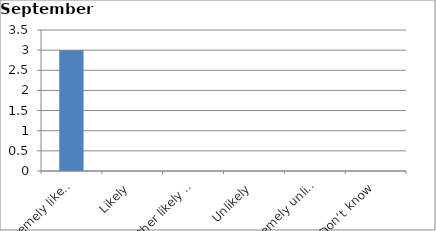
| Category | Series 0 |
|---|---|
| Extremely likely | 3 |
| Likely | 0 |
| Neither likely nor unlikely | 0 |
| Unlikely | 0 |
| Extremely unlikely | 0 |
| Don’t know | 0 |